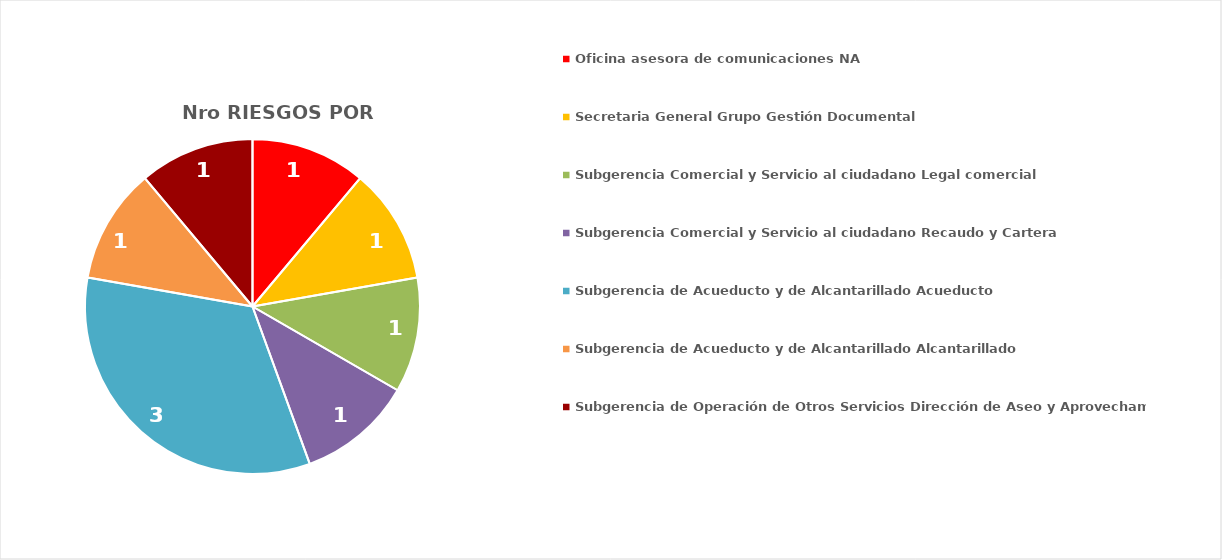
| Category | Total |
|---|---|
| 0 | 1 |
| 1 | 1 |
| 2 | 1 |
| 3 | 1 |
| 4 | 3 |
| 5 | 1 |
| 6 | 1 |